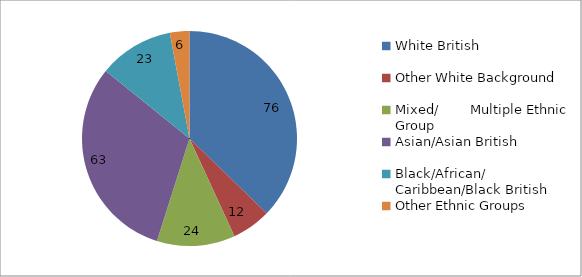
| Category | Series 0 |
|---|---|
| White British | 76 |
| Other White Background | 12 |
| Mixed/        Multiple Ethnic Group | 24 |
| Asian/Asian British | 63 |
| Black/African/  Caribbean/Black British | 23 |
| Other Ethnic Groups | 6 |